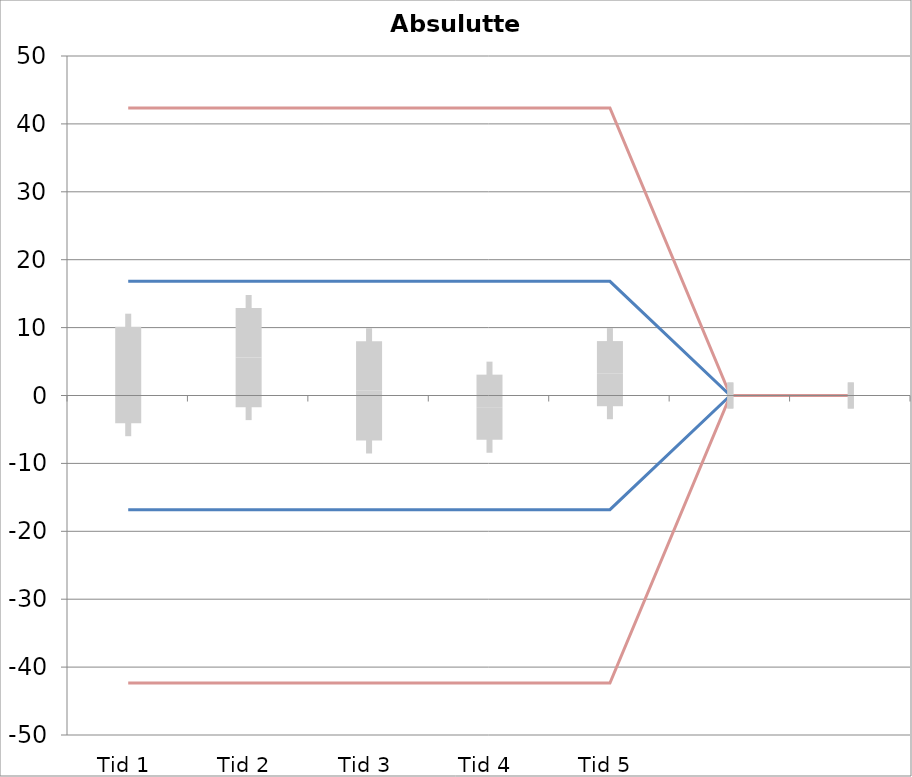
| Category | 1 | 2 | 3 | 4 | 5 | 6 | 7 | 8 | 9 | 10 | 11 | 12 | 13 | 14 | 15 | 16 | 17 | 18 | 19 | 20 | TEa | B | -B | -TEa | M |
|---|---|---|---|---|---|---|---|---|---|---|---|---|---|---|---|---|---|---|---|---|---|---|---|---|---|
| Tid 1 | 2.9 | 0.7 | 8.1 | 2.1 | 5 | 1.9 | 0.6 | 36 | 25.6 | 2.1 | -6.2 | -11 | -12.4 | -7.9 | -2.1 | 0 | 0 | 0 | 0 | 0 | 42.357 | 16.812 | -16.812 | -42.357 | 3.027 |
| Tid 2 | 4.4 | 1.4 | 7.2 | 6.8 | 4.8 | 2.8 | -0.1 | 41.4 | 15.3 | 4.1 | -13.5 | 19.2 | -14.5 | 4.9 | -0.4 | 0 | 0 | 0 | 0 | 0 | 42.357 | 16.812 | -16.812 | -42.357 | 5.587 |
| Tid 3 | 6.9 | -0.1 | 7.1 | 2.2 | 5.4 | 4.4 | -2.1 | 29.1 | 11.1 | 2.3 | -18 | -11.2 | -21.9 | 0 | -5.6 | 0 | 0 | 0 | 0 | 0 | 42.357 | 16.812 | -16.812 | -42.357 | 0.686 |
| Tid 4 | 6 | -0.8 | 11 | -11.2 | 0.1 | 1.9 | -2.7 | 0 | 5.1 | 1.7 | -8.8 | -27.9 | -5.8 | 0 | -0.2 | -3.3 | 17.6 | -9.7 | -2.3 | 0 | 42.357 | 16.812 | -16.812 | -42.357 | -1.724 |
| Tid 5 | 0 | -0.8 | 2.4 | -5.4 | 6 | 2.9 | 0.1 | 0 | 18.3 | 1.7 | 0 | 0 | 0 | 0 | 0 | -3.4 | 18.7 | -8.1 | 6.2 | 0 | 42.357 | 16.812 | -16.812 | -42.357 | 3.217 |